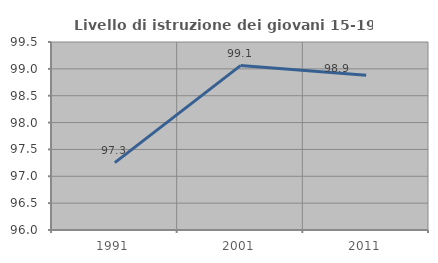
| Category | Livello di istruzione dei giovani 15-19 anni |
|---|---|
| 1991.0 | 97.255 |
| 2001.0 | 99.061 |
| 2011.0 | 98.883 |